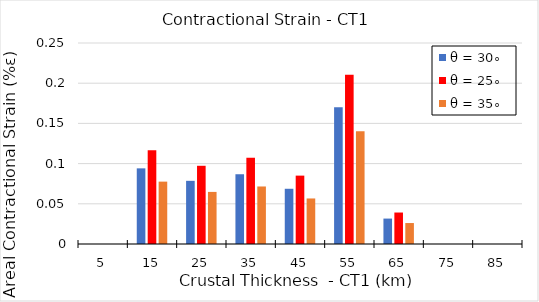
| Category | θ = 30∘ | θ = 25∘ | θ = 35∘ |
|---|---|---|---|
| 5.0 | 0 | 0 | 0 |
| 15.0 | 0.094 | 0.116 | 0.078 |
| 25.0 | 0.079 | 0.097 | 0.065 |
| 35.0 | 0.087 | 0.107 | 0.072 |
| 45.0 | 0.069 | 0.085 | 0.057 |
| 55.0 | 0.17 | 0.211 | 0.14 |
| 65.0 | 0.032 | 0.039 | 0.026 |
| 75.0 | 0 | 0 | 0 |
| 85.0 | 0 | 0 | 0 |